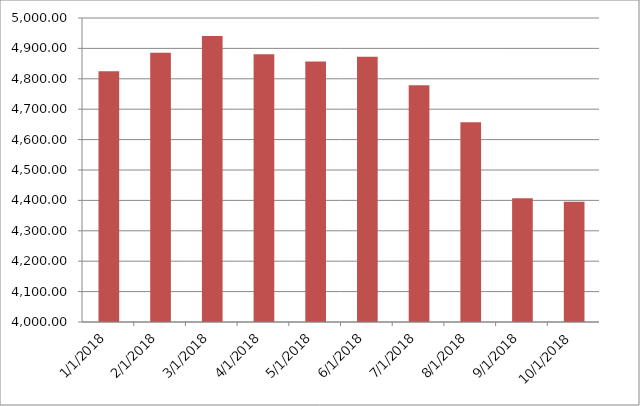
| Category | Series 0 | Series 1 |
|---|---|---|
| 1/1/18 |  | 4824.67 |
| 2/1/18 |  | 4886.02 |
| 3/1/18 |  | 4940.96 |
| 4/1/18 |  | 4880.65 |
| 5/1/18 |  | 4856.99 |
| 6/1/18 |  | 4872.61 |
| 7/1/18 |  | 4778.58 |
| 8/1/18 |  | 4657.45 |
| 9/1/18 |  | 4407.05 |
| 10/1/18 |  | 4395.43 |